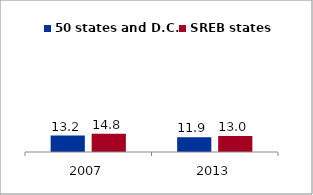
| Category | 50 states and D.C. | SREB states |
|---|---|---|
| 2007.0 | 13.237 | 14.799 |
| 2013.0 | 11.881 | 12.962 |